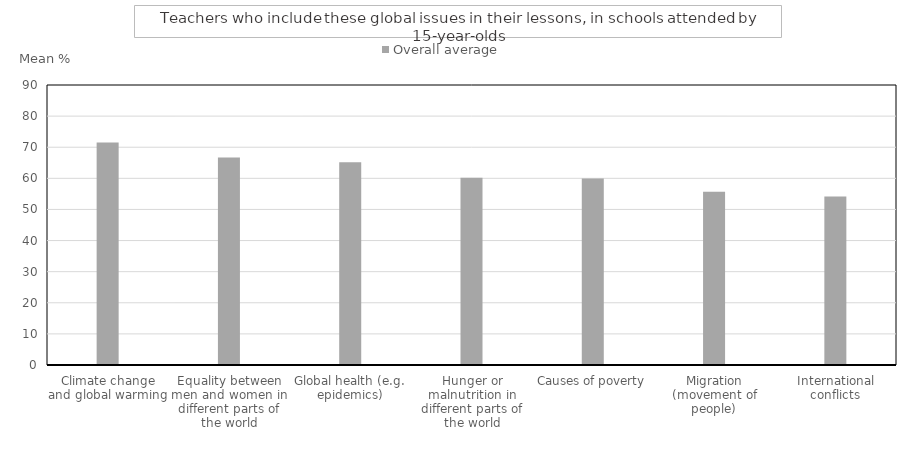
| Category | Overall average |
|---|---|
| Climate change and global warming | 71.536 |
| Equality between men and women in different parts of the world | 66.718 |
| Global health (e.g. epidemics) | 65.171 |
| Hunger or malnutrition in different parts of the world | 60.17 |
| Causes of poverty | 59.971 |
| Migration (movement of people) | 55.665 |
| International conflicts | 54.189 |